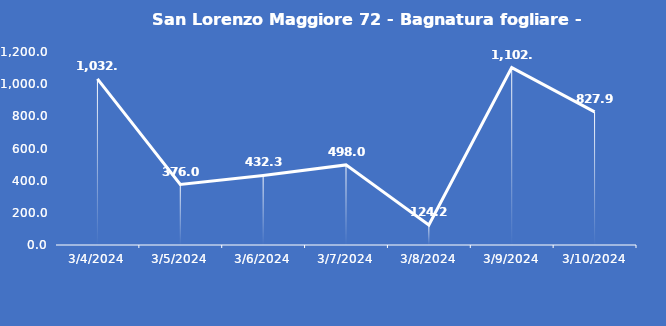
| Category | San Lorenzo Maggiore 72 - Bagnatura fogliare - Grezzo (min) |
|---|---|
| 3/4/24 | 1032.5 |
| 3/5/24 | 376 |
| 3/6/24 | 432.3 |
| 3/7/24 | 498 |
| 3/8/24 | 124.2 |
| 3/9/24 | 1102.8 |
| 3/10/24 | 827.9 |